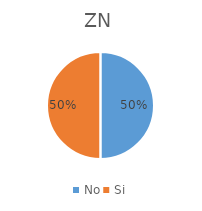
| Category | ZN |
|---|---|
| No | 0.5 |
| Si | 0.5 |